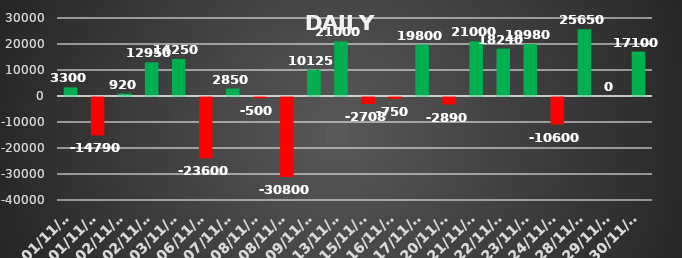
| Category | Series 0 |
|---|---|
| 2023-11-01 | 3300 |
| 2023-11-01 | -14790 |
| 2023-11-02 | 920 |
| 2023-11-02 | 12950 |
| 2023-11-03 | 14250 |
| 2023-11-06 | -23600 |
| 2023-11-07 | 2850 |
| 2023-11-08 | -500 |
| 2023-11-08 | -30800 |
| 2023-11-09 | 10125 |
| 2023-11-13 | 21000 |
| 2023-11-15 | -2707.5 |
| 2023-11-16 | -750 |
| 2023-11-17 | 19800 |
| 2023-11-20 | -2890 |
| 2023-11-21 | 21000 |
| 2023-11-22 | 18240 |
| 2023-11-23 | 19980 |
| 2023-11-24 | -10600 |
| 2023-11-28 | 25650 |
| 2023-11-29 | 0 |
| 2023-11-30 | 17100 |